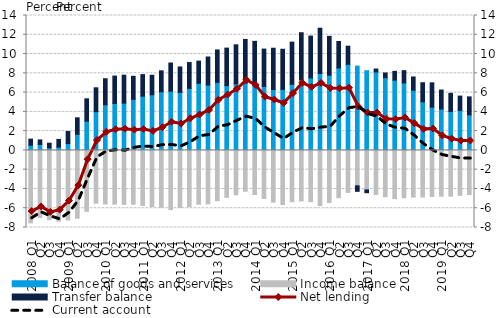
| Category | Balance of goods and services | Income balance | Transfer balance |
|---|---|---|---|
| 2008 Q1 | 0.541 | -7.517 | 0.63 |
| Q2 | 0.61 | -6.952 | 0.477 |
| Q3 | 0.274 | -7.183 | 0.474 |
| Q4 | 0.347 | -7.34 | 0.794 |
| 2009 Q1 | 0.707 | -7.213 | 1.254 |
| Q2 | 1.678 | -7.037 | 1.705 |
| Q3 | 3.032 | -6.318 | 2.322 |
| Q4 | 4.018 | -5.474 | 2.481 |
| 2010 Q1 | 4.733 | -5.559 | 2.704 |
| Q2 | 4.878 | -5.574 | 2.835 |
| Q3 | 4.907 | -5.606 | 2.9 |
| Q4 | 5.301 | -5.589 | 2.389 |
| 2011 Q1 | 5.624 | -5.706 | 2.245 |
| Q2 | 5.775 | -5.824 | 2.023 |
| Q3 | 6.081 | -5.899 | 2.176 |
| Q4 | 6.149 | -6.144 | 2.922 |
| 2012 Q1 | 6.025 | -5.919 | 2.637 |
| Q2 | 6.439 | -5.84 | 2.678 |
| Q3 | 6.964 | -5.588 | 2.302 |
| Q4 | 6.784 | -5.544 | 2.91 |
| 2013 Q1 | 7.06 | -5.222 | 3.365 |
| Q2 | 6.724 | -4.871 | 3.891 |
| Q3 | 6.907 | -4.607 | 4.049 |
| Q4 | 6.986 | -4.238 | 4.531 |
| 2014 Q1 | 7.05 | -4.575 | 4.269 |
| Q2 | 6.636 | -4.987 | 3.879 |
| Q3 | 6.319 | -5.374 | 4.283 |
| Q4 | 6.338 | -5.617 | 4.159 |
| 2015 Q1 | 6.867 | -5.332 | 4.369 |
| Q2 | 7.345 | -5.243 | 4.867 |
| Q3 | 7.52 | -5.314 | 4.345 |
| Q4 | 7.984 | -5.723 | 4.697 |
| 2016 Q1 | 7.809 | -5.409 | 4.026 |
| Q2 | 8.56 | -4.903 | 2.741 |
| Q3 | 8.935 | -4.362 | 1.88 |
| Q4 | 8.747 | -3.673 | -0.574 |
| 2017 Q1 | 8.271 | -4.098 | -0.292 |
| Q2 | 8.152 | -4.569 | 0.294 |
| Q3 | 7.545 | -4.8 | 0.49 |
| Q4 | 7.291 | -5.008 | 0.913 |
| 2018 Q1 | 7.006 | -4.917 | 1.273 |
| Q2 | 6.247 | -4.844 | 1.377 |
| Q3 | 5.038 | -4.84 | 1.986 |
| Q4 | 4.489 | -4.784 | 2.521 |
| 2019 Q1 | 4.296 | -4.755 | 1.969 |
| Q2 | 4.049 | -4.753 | 1.875 |
| Q3 | 4.154 | -4.665 | 1.483 |
| Q4 | 3.692 | -4.577 | 1.863 |